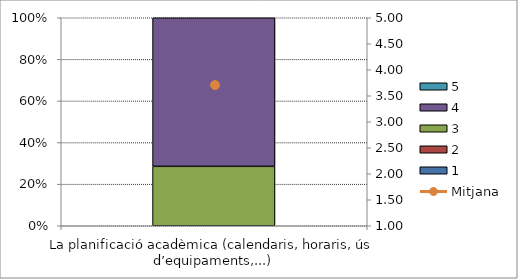
| Category | 1 | 2 | 3 | 4 | 5 |
|---|---|---|---|---|---|
| La planificació acadèmica (calendaris, horaris, ús d’equipaments,...) | 0 | 0 | 2 | 5 | 0 |